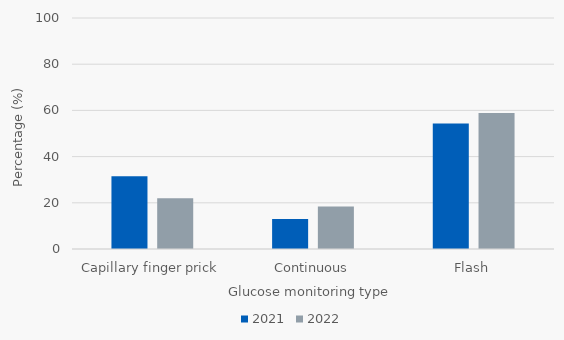
| Category | 2021 | 2022 |
|---|---|---|
| Capillary finger prick | 31.45 | 22.01 |
| Continuous | 13.022 | 18.421 |
| Flash | 54.3 | 58.852 |